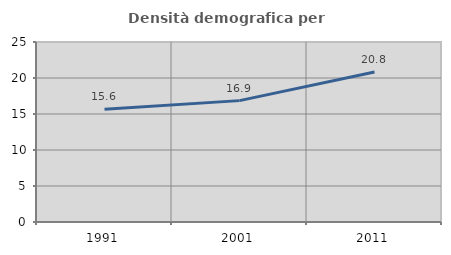
| Category | Densità demografica |
|---|---|
| 1991.0 | 15.644 |
| 2001.0 | 16.857 |
| 2011.0 | 20.836 |